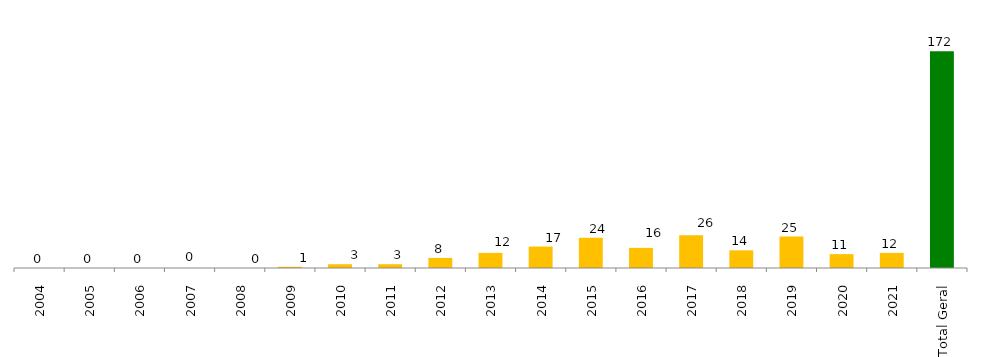
| Category | Categoria/Ano |
|---|---|
| 2004 | 0 |
| 2005 | 0 |
| 2006 | 0 |
| 2007 | 0 |
| 2008 | 0 |
| 2009 | 1 |
| 2010 | 3 |
| 2011 | 3 |
| 2012 | 8 |
| 2013 | 12 |
| 2014 | 17 |
| 2015 | 24 |
| 2016 | 16 |
| 2017 | 26 |
| 2018 | 14 |
| 2019 | 25 |
| 2020 | 11 |
| 2021 | 12 |
| Total Geral | 172 |